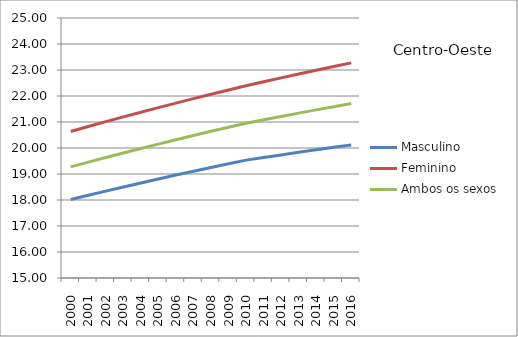
| Category | Masculino | Feminino | Ambos os sexos |
|---|---|---|---|
| 2000.0 | 18.019 | 20.637 | 19.273 |
| 2001.0 | 18.182 | 20.829 | 19.455 |
| 2002.0 | 18.343 | 21.016 | 19.634 |
| 2003.0 | 18.501 | 21.199 | 19.809 |
| 2004.0 | 18.656 | 21.378 | 19.981 |
| 2005.0 | 18.808 | 21.554 | 20.15 |
| 2006.0 | 18.958 | 21.728 | 20.317 |
| 2007.0 | 19.106 | 21.898 | 20.48 |
| 2008.0 | 19.251 | 22.066 | 20.641 |
| 2009.0 | 19.393 | 22.23 | 20.799 |
| 2010.0 | 19.534 | 22.393 | 20.955 |
| 2011.0 | 19.635 | 22.546 | 21.086 |
| 2012.0 | 19.735 | 22.698 | 21.215 |
| 2013.0 | 19.833 | 22.846 | 21.342 |
| 2014.0 | 19.93 | 22.992 | 21.467 |
| 2015.0 | 20.026 | 23.134 | 21.59 |
| 2016.0 | 20.119 | 23.274 | 21.711 |